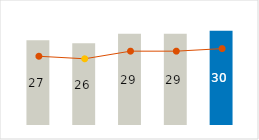
| Category | Fixed Cost |
|---|---|
| 0 | 27 |
| 1 | 26 |
| 2 | 29 |
| 3 | 29 |
| 4 | 30 |